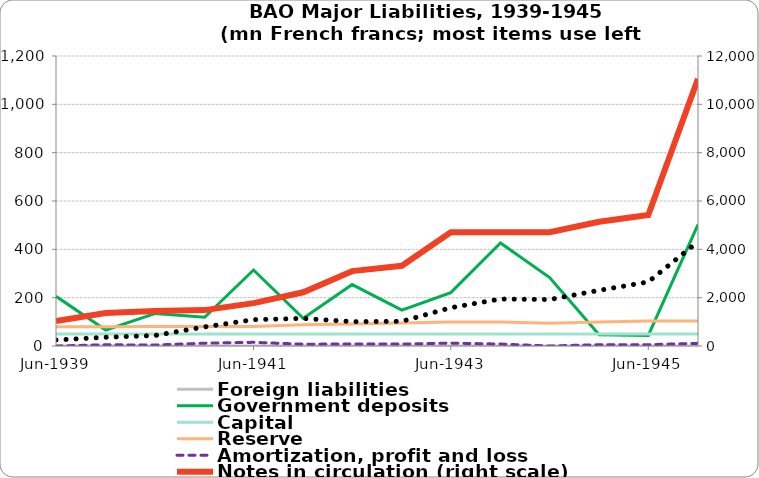
| Category | Foreign liabilities | Government deposits | Capital  | Reserve | Amortization, profit and loss |
|---|---|---|---|---|---|
| 1939-06-30 | 0 | 205.468 | 50 | 79.754 | 0 |
| 1939-12-31 | 0 | 65.972 | 50 | 79.754 | 4.981 |
| 1940-06-30 | 0 | 134.066 | 50 | 80.501 | 4.041 |
| 1940-12-31 | 0 | 118.885 | 50 | 80.501 | 11.595 |
| 1941-06-30 | 0 | 314.47 | 50 | 81.107 | 15.2 |
| 1941-12-31 | 0 | 114.682 | 50 | 88.073 | 7.496 |
| 1942-06-30 | 0 | 254.039 | 50 | 91.46 | 8.219 |
| 1942-12-31 | 0 | 148.637 | 50 | 95.415 | 8.136 |
| 1943-06-30 | 0 | 220.837 | 50 | 99.302 | 11.91 |
| 1943-12-31 | 0 | 426.118 | 50 | 99.302 | 8.053 |
| 1944-06-30 | 0 | 283.206 | 50 | 94.363 | 0 |
| 1944-12-30 | 0 | 46.401 | 50 | 99.302 | 5.479 |
| 1945-06-30 | 0 | 43.926 | 50 | 103.272 | 5.497 |
| 1945-12-31 | 0 | 502.335 | 50 | 103.272 | 10.983 |